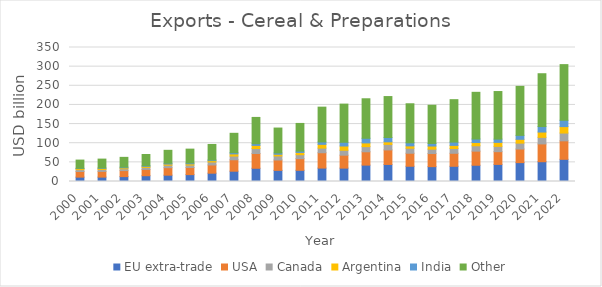
| Category | EU extra-trade | USA | Canada | Argentina | India | Other  |
|---|---|---|---|---|---|---|
| 2000.0 | 11419.756 | 14702.634 | 4814.979 | 2833.471 | 742.868 | 21426.173 |
| 2001.0 | 11456.837 | 14940.638 | 5088.45 | 2807.646 | 1060.873 | 23147.763 |
| 2002.0 | 12783.548 | 15730.326 | 4744.972 | 2504.041 | 1771.097 | 25527.699 |
| 2003.0 | 15143.328 | 16502.803 | 5114.85 | 2781.514 | 1655.057 | 29285.017 |
| 2004.0 | 16517.596 | 19574.712 | 6360.511 | 3171.314 | 2099 | 33722.02 |
| 2005.0 | 17946.67 | 18537.085 | 6299.415 | 3338.231 | 2206.35 | 36220.649 |
| 2006.0 | 21718.808 | 21471.801 | 7734.812 | 3644.128 | 1878.152 | 40288.48 |
| 2007.0 | 26897.964 | 29833.644 | 9730.112 | 5620.601 | 3155.676 | 50630.334 |
| 2008.0 | 34569.115 | 38495.459 | 13007.38 | 8233.335 | 4446.405 | 68614.835 |
| 2009.0 | 29104.69 | 27064.093 | 10604.603 | 4328.286 | 3439.384 | 65057.793 |
| 2010.0 | 29282.675 | 30457.445 | 10212.942 | 5929.899 | 3485.285 | 72295.097 |
| 2011.0 | 35079.845 | 40045.882 | 12112.776 | 9822.966 | 6171.803 | 90974.106 |
| 2012.0 | 34955.511 | 33776.583 | 12840.752 | 11179.267 | 9653.245 | 99727.167 |
| 2013.0 | 42801.386 | 34835.45 | 13501.298 | 9668.171 | 12050.824 | 103221.648 |
| 2014.0 | 44547.062 | 37978.655 | 14385.587 | 6709.846 | 11260.682 | 106976.83 |
| 2015.0 | 39842.118 | 34002.152 | 13050.175 | 6092.87 | 8108.984 | 101931.552 |
| 2016.0 | 38783.22 | 34249.221 | 11482.86 | 8095.181 | 6743.692 | 99806.399 |
| 2017.0 | 39742.297 | 33949.908 | 12491.093 | 8100.67 | 8595.711 | 110862.585 |
| 2018.0 | 42436.943 | 36891.821 | 14015.218 | 8492.544 | 9142.782 | 121964.744 |
| 2019.0 | 44646.368 | 33284.414 | 13918.601 | 10311.38 | 8549.129 | 124266.967 |
| 2020.0 | 49296.497 | 35604.15 | 15317.946 | 9946.45 | 10312.33 | 128068.098 |
| 2021.0 | 51665.181 | 46501.236 | 17140.821 | 13847.213 | 14317.662 | 138019.257 |
| 2022.0 | 57967.099 | 48232.964 | 20357.674 | 16830.143 | 16512.935 | 145369.578 |